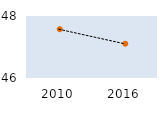
| Category | Max | OECD mean | Min |
|---|---|---|---|
| 2010.0 | 87.344 | 47.573 | 17.503 |
| 2016.0 | 86.933 | 47.106 | 12.838 |